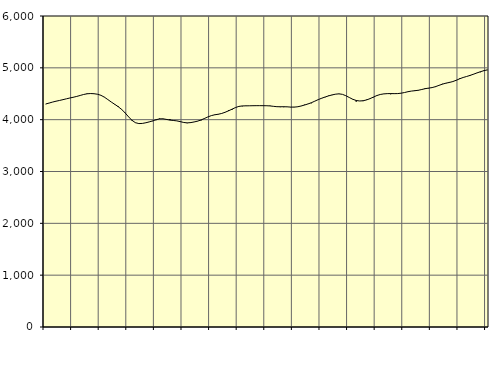
| Category | Piggar | Series 1 |
|---|---|---|
| nan | 4299.6 | 4302.85 |
| 87.0 | 4319.5 | 4320.87 |
| 87.0 | 4340.4 | 4339.79 |
| 87.0 | 4355.3 | 4356.32 |
| nan | 4371.7 | 4370.63 |
| 88.0 | 4384.7 | 4386.11 |
| 88.0 | 4402.2 | 4402.54 |
| 88.0 | 4418.8 | 4417.79 |
| nan | 4428.6 | 4432.63 |
| 89.0 | 4447.8 | 4448.62 |
| 89.0 | 4468.8 | 4467.32 |
| 89.0 | 4485 | 4485.98 |
| nan | 4507 | 4499.36 |
| 90.0 | 4500.9 | 4503.99 |
| 90.0 | 4499.3 | 4500.45 |
| 90.0 | 4489.2 | 4490.55 |
| nan | 4472.2 | 4469.86 |
| 91.0 | 4438.5 | 4434.47 |
| 91.0 | 4386.8 | 4387.93 |
| 91.0 | 4339.8 | 4340.25 |
| nan | 4290.2 | 4296.49 |
| 92.0 | 4263.4 | 4251.21 |
| 92.0 | 4193 | 4197.79 |
| 92.0 | 4137.7 | 4131.39 |
| nan | 4060.1 | 4056.12 |
| 93.0 | 3976.1 | 3987.63 |
| 93.0 | 3944.5 | 3941.72 |
| 93.0 | 3927.3 | 3924.56 |
| nan | 3926.6 | 3927.34 |
| 94.0 | 3942.6 | 3940.07 |
| 94.0 | 3954.9 | 3956.75 |
| 94.0 | 3970.7 | 3976.31 |
| nan | 3990.5 | 3998.85 |
| 95.0 | 4023.6 | 4015.35 |
| 95.0 | 4018.5 | 4016.52 |
| 95.0 | 3996.5 | 4004.92 |
| nan | 4012.7 | 3991.93 |
| 96.0 | 3979.8 | 3984.38 |
| 96.0 | 3975.7 | 3976.5 |
| 96.0 | 3969.1 | 3962.04 |
| nan | 3943.6 | 3946.07 |
| 97.0 | 3932.6 | 3938.09 |
| 97.0 | 3951.8 | 3943.47 |
| 97.0 | 3956.4 | 3955.57 |
| nan | 3973.9 | 3971.02 |
| 98.0 | 3983.9 | 3993.59 |
| 98.0 | 4028.5 | 4022.61 |
| 98.0 | 4051.2 | 4052.25 |
| nan | 4078 | 4078.07 |
| 99.0 | 4098.6 | 4093.96 |
| 99.0 | 4099.4 | 4104.6 |
| 99.0 | 4116.9 | 4119.55 |
| nan | 4140.5 | 4142.93 |
| 0.0 | 4184.4 | 4171.06 |
| 0.0 | 4188.1 | 4202.1 |
| 0.0 | 4236.5 | 4233.3 |
| nan | 4261.6 | 4255.85 |
| 1.0 | 4257.6 | 4265.09 |
| 1.0 | 4270.9 | 4266.54 |
| 1.0 | 4268.2 | 4267.8 |
| nan | 4274 | 4268.92 |
| 2.0 | 4267.7 | 4269.7 |
| 2.0 | 4272 | 4270.27 |
| 2.0 | 4270.6 | 4269.98 |
| nan | 4265.3 | 4268.73 |
| 3.0 | 4270.3 | 4265.29 |
| 3.0 | 4258.9 | 4257.48 |
| 3.0 | 4247.1 | 4250.19 |
| nan | 4241.9 | 4248.96 |
| 4.0 | 4240.8 | 4249.6 |
| 4.0 | 4244.2 | 4247.27 |
| 4.0 | 4240 | 4243 |
| nan | 4245.6 | 4242.08 |
| 5.0 | 4251.4 | 4248.45 |
| 5.0 | 4262.4 | 4262.85 |
| 5.0 | 4288.7 | 4281.87 |
| nan | 4304.6 | 4302.37 |
| 6.0 | 4316.1 | 4326.82 |
| 6.0 | 4358.1 | 4356.8 |
| 6.0 | 4385.7 | 4387.06 |
| nan | 4409.6 | 4413.5 |
| 7.0 | 4432.8 | 4437.39 |
| 7.0 | 4465.1 | 4458.77 |
| 7.0 | 4473.8 | 4477.18 |
| nan | 4493.4 | 4491.68 |
| 8.0 | 4494.3 | 4497.96 |
| 8.0 | 4488.8 | 4488.73 |
| 8.0 | 4462.5 | 4462.02 |
| nan | 4429.2 | 4427.72 |
| 9.0 | 4390.5 | 4393.7 |
| 9.0 | 4346.3 | 4370.13 |
| 9.0 | 4361.5 | 4360.32 |
| nan | 4357.9 | 4364.96 |
| 10.0 | 4386.9 | 4380.88 |
| 10.0 | 4402.3 | 4405.5 |
| 10.0 | 4430.6 | 4436.11 |
| nan | 4470.5 | 4465.43 |
| 11.0 | 4489 | 4486.14 |
| 11.0 | 4494.9 | 4497.08 |
| 11.0 | 4505.3 | 4502.24 |
| nan | 4489.7 | 4503.45 |
| 12.0 | 4504.6 | 4501.94 |
| 12.0 | 4500.2 | 4503.12 |
| 12.0 | 4509.6 | 4510.57 |
| nan | 4523.9 | 4523.44 |
| 13.0 | 4536.8 | 4539.29 |
| 13.0 | 4551.2 | 4551.52 |
| 13.0 | 4566.9 | 4558.54 |
| nan | 4561.9 | 4567.28 |
| 14.0 | 4577 | 4581.77 |
| 14.0 | 4610.1 | 4597.8 |
| 14.0 | 4602.5 | 4608.94 |
| nan | 4618.6 | 4619.01 |
| 15.0 | 4629.4 | 4636.96 |
| 15.0 | 4661.7 | 4661.65 |
| 15.0 | 4691.6 | 4685.3 |
| nan | 4699.5 | 4704.17 |
| 16.0 | 4727.4 | 4717.72 |
| 16.0 | 4730.4 | 4734.95 |
| 16.0 | 4756.3 | 4760 |
| nan | 4799 | 4788.86 |
| 17.0 | 4813.3 | 4813.65 |
| 17.0 | 4833.5 | 4832.76 |
| 17.0 | 4845.7 | 4853.55 |
| nan | 4880 | 4877.1 |
| 18.0 | 4902.9 | 4901.24 |
| 18.0 | 4914.9 | 4924.8 |
| 18.0 | 4952.5 | 4944.73 |
| nan | 4955.2 | 4960.81 |